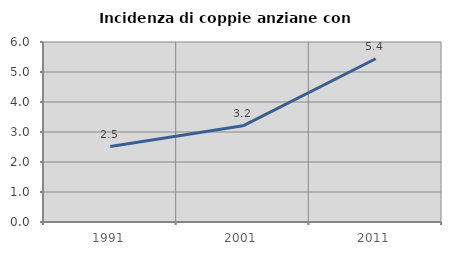
| Category | Incidenza di coppie anziane con figli |
|---|---|
| 1991.0 | 2.516 |
| 2001.0 | 3.205 |
| 2011.0 | 5.442 |